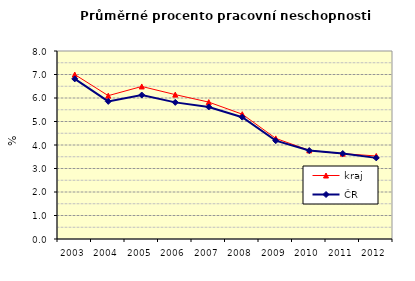
| Category | kraj | ČR |
|---|---|---|
| 2003.0 | 6.999 | 6.814 |
| 2004.0 | 6.099 | 5.857 |
| 2005.0 | 6.491 | 6.126 |
| 2006.0 | 6.144 | 5.814 |
| 2007.0 | 5.825 | 5.619 |
| 2008.0 | 5.311 | 5.184 |
| 2009.0 | 4.281 | 4.184 |
| 2010.0 | 3.771 | 3.763 |
| 2011.0 | 3.632 | 3.638 |
| 2012.0 | 3.533 | 3.452 |